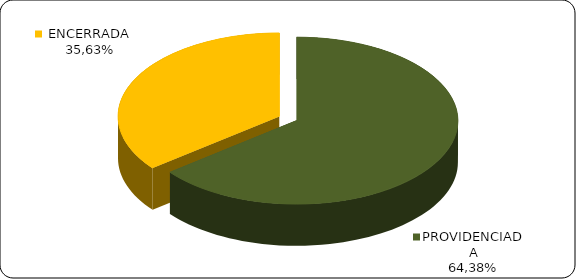
| Category | Series 0 |
|---|---|
|      PROVIDENCIADA | 0.644 |
|      ENCERRADA | 0.356 |